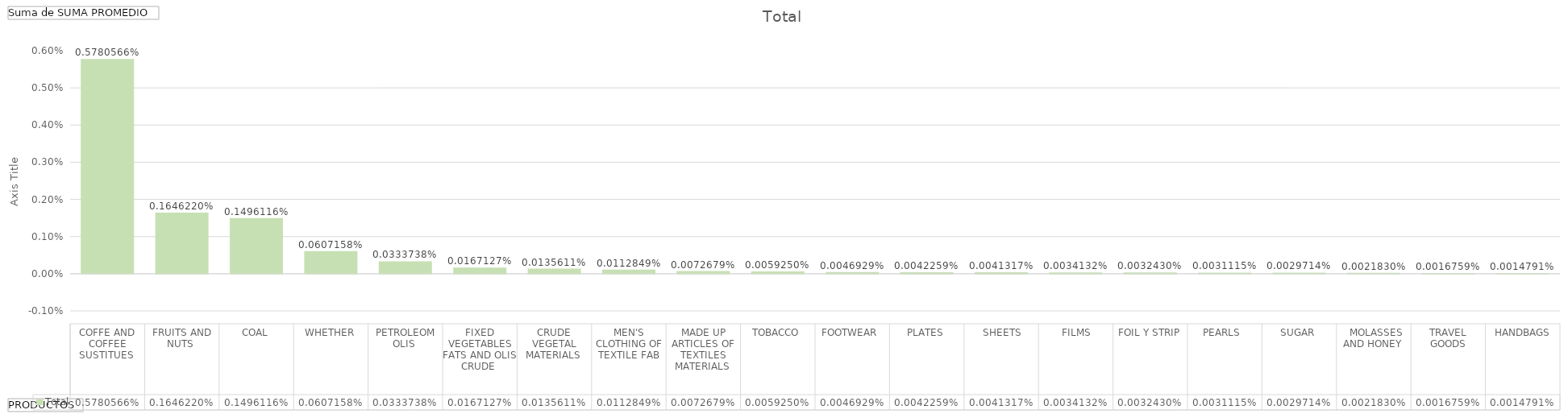
| Category | Total |
|---|---|
| COFFE AND COFFEE SUSTITUES  | 0.006 |
| FRUITS AND NUTS  | 0.002 |
| COAL, WHETHER  | 0.001 |
| PETROLEOM OLIS  | 0.001 |
| FIXED VEGETABLES FATS AND OLIS CRUDE  | 0 |
| CRUDE VEGETAL MATERIALS  | 0 |
| MEN'S CLOTHING OF TEXTILE FAB | 0 |
| MADE UP ARTICLES OF TEXTILES MATERIALS  | 0 |
| TOBACCO | 0 |
| FOOTWEAR  | 0 |
| PLATES, SHEETS, FILMS, FOIL Y STRIP  | 0 |
| PEARLS  | 0 |
| SUGAR, MOLASSES AND HONEY  | 0 |
| TRAVEL GOODS, HANDBAGS | 0 |
| FISH FRESH  | 0 |
| STARCHE, WHEAT GLUTEN  | 0 |
| GLASS  | 0 |
| MEDICINAL AND PHARMACEUTICAL PRODUCTS  | 0 |
| COCOA  | 0 |
| BABYS CARRIAGES, TOYS GAMES  | 0 |